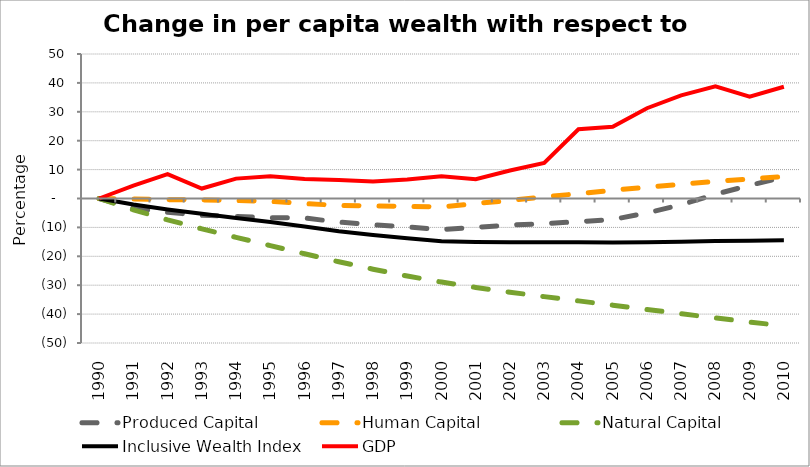
| Category | Produced Capital  | Human Capital | Natural Capital | Inclusive Wealth Index | GDP |
|---|---|---|---|---|---|
| 1990.0 | 0 | 0 | 0 | 0 | 0 |
| 1991.0 | -3.359 | -0.182 | -3.912 | -2.106 | 4.473 |
| 1992.0 | -4.795 | -0.39 | -7.379 | -3.834 | 8.42 |
| 1993.0 | -5.811 | -0.471 | -10.495 | -5.308 | 3.452 |
| 1994.0 | -6.249 | -0.684 | -13.438 | -6.711 | 6.879 |
| 1995.0 | -6.644 | -0.975 | -16.285 | -8.105 | 7.655 |
| 1996.0 | -6.755 | -1.747 | -19.136 | -9.696 | 6.754 |
| 1997.0 | -8.154 | -2.405 | -21.882 | -11.324 | 6.387 |
| 1998.0 | -9.134 | -2.587 | -24.466 | -12.614 | 5.858 |
| 1999.0 | -9.803 | -2.745 | -26.819 | -13.764 | 6.563 |
| 2000.0 | -10.792 | -2.888 | -28.915 | -14.829 | 7.674 |
| 2001.0 | -9.977 | -1.764 | -30.769 | -15.009 | 6.661 |
| 2002.0 | -9.183 | -0.638 | -32.426 | -15.107 | 9.672 |
| 2003.0 | -8.717 | 0.508 | -33.953 | -15.173 | 12.334 |
| 2004.0 | -8.007 | 1.69 | -35.43 | -15.176 | 23.957 |
| 2005.0 | -7.275 | 2.86 | -36.906 | -15.182 | 24.855 |
| 2006.0 | -5.008 | 3.894 | -38.393 | -15.097 | 31.244 |
| 2007.0 | -2.145 | 4.92 | -39.879 | -14.954 | 35.714 |
| 2008.0 | 1.456 | 5.928 | -41.333 | -14.728 | 38.832 |
| 2009.0 | 4.551 | 6.784 | -42.738 | -14.605 | 35.276 |
| 2010.0 | 7.415 | 7.633 | -44.081 | -14.483 | 38.652 |